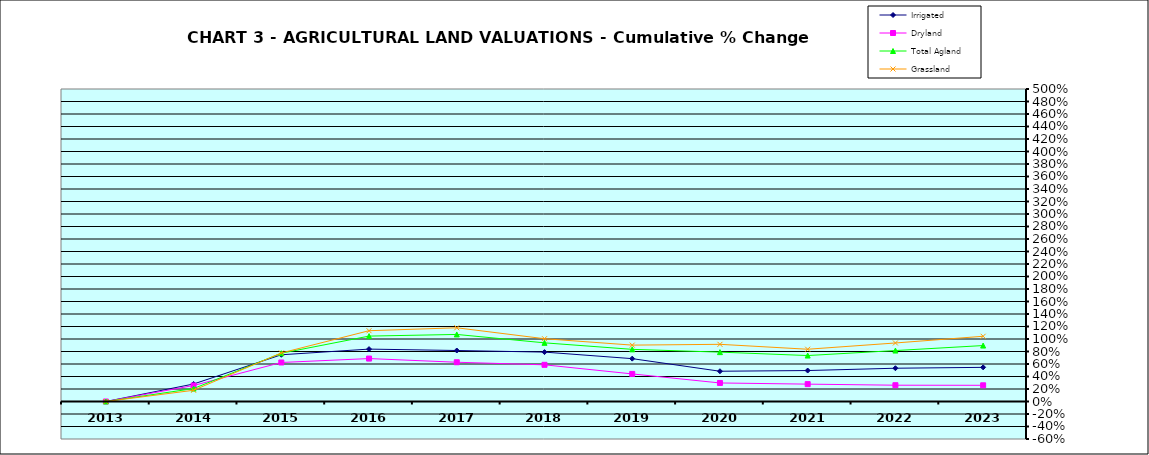
| Category | Irrigated | Dryland | Total Agland | Grassland |
|---|---|---|---|---|
| 2013.0 | 0 | 0 | 0 | 0 |
| 2014.0 | 0.28 | 0.256 | 0.207 | 0.18 |
| 2015.0 | 0.748 | 0.624 | 0.772 | 0.777 |
| 2016.0 | 0.838 | 0.687 | 1.046 | 1.133 |
| 2017.0 | 0.816 | 0.628 | 1.073 | 1.179 |
| 2018.0 | 0.79 | 0.587 | 0.939 | 1.004 |
| 2019.0 | 0.686 | 0.441 | 0.834 | 0.902 |
| 2020.0 | 0.484 | 0.297 | 0.79 | 0.915 |
| 2021.0 | 0.495 | 0.278 | 0.735 | 0.836 |
| 2022.0 | 0.532 | 0.261 | 0.815 | 0.936 |
| 2023.0 | 0.546 | 0.259 | 0.895 | 1.044 |